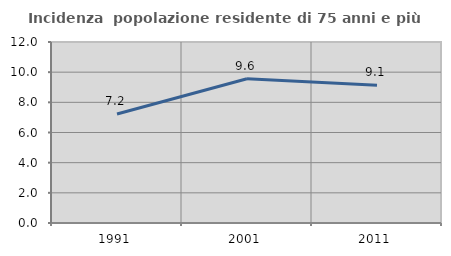
| Category | Incidenza  popolazione residente di 75 anni e più |
|---|---|
| 1991.0 | 7.222 |
| 2001.0 | 9.568 |
| 2011.0 | 9.13 |